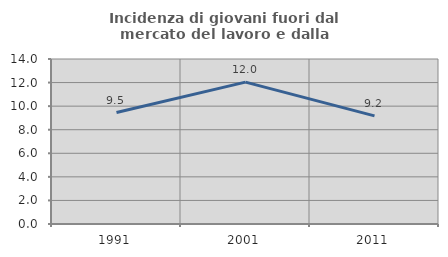
| Category | Incidenza di giovani fuori dal mercato del lavoro e dalla formazione  |
|---|---|
| 1991.0 | 9.456 |
| 2001.0 | 12.037 |
| 2011.0 | 9.172 |